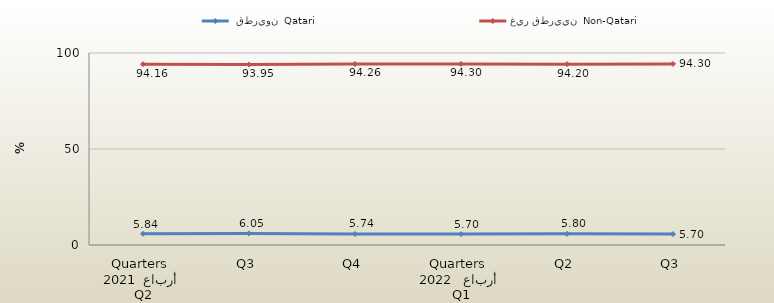
| Category |  قطريون  Qatari | غير قطريين  Non-Qatari |
|---|---|---|
| 0 | 5.836 | 94.164 |
| 1 | 6.047 | 93.953 |
| 2 | 5.737 | 94.263 |
| 3 | 5.7 | 94.3 |
| 4 | 5.8 | 94.2 |
| 5 | 5.7 | 94.3 |